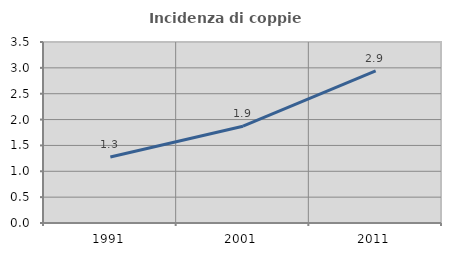
| Category | Incidenza di coppie miste |
|---|---|
| 1991.0 | 1.275 |
| 2001.0 | 1.871 |
| 2011.0 | 2.941 |